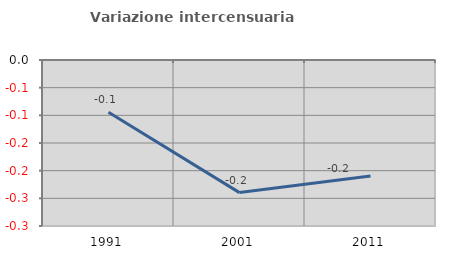
| Category | Variazione intercensuaria annua |
|---|---|
| 1991.0 | -0.094 |
| 2001.0 | -0.24 |
| 2011.0 | -0.21 |